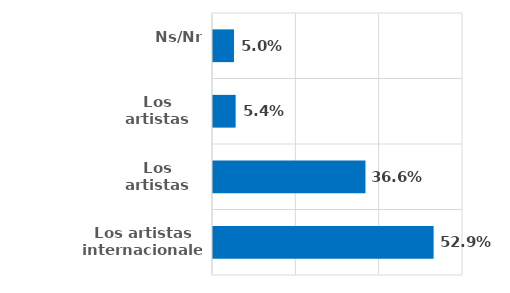
| Category | Series 0 |
|---|---|
| Los artistas internacionales | 0.529 |
| Los artistas nacionales | 0.366 |
| Los artistas distritales  | 0.054 |
| Ns/Nr | 0.05 |